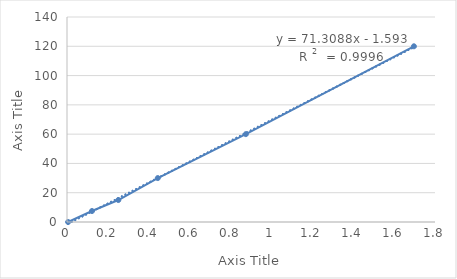
| Category | Series 0 |
|---|---|
| 0.0054 | 0 |
| 0.1222 | 7.5 |
| 0.2511 | 15 |
| 0.4441 | 30 |
| 0.8748 | 60 |
| 1.6969 | 120 |